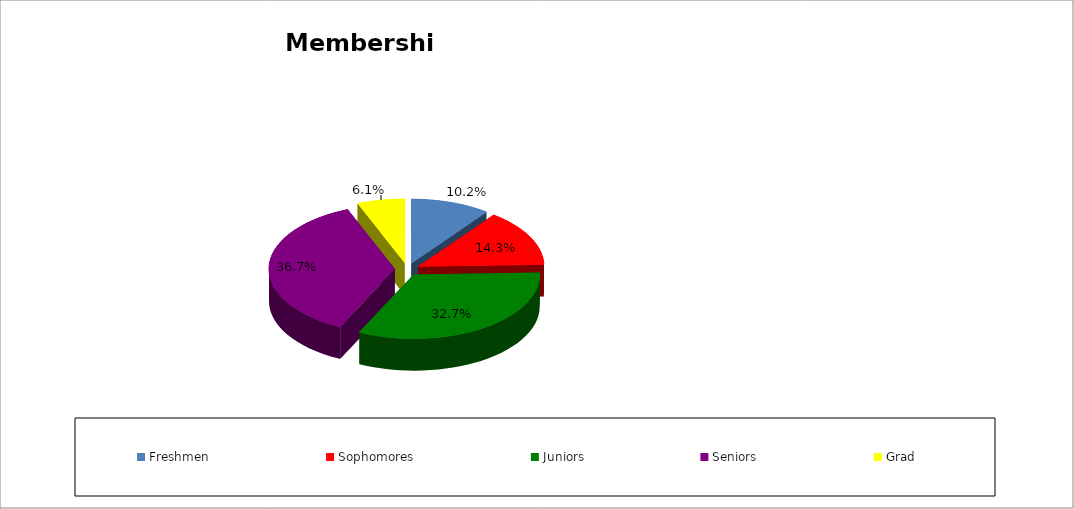
| Category | Series 0 |
|---|---|
| Freshmen | 5 |
| Sophomores | 7 |
| Juniors | 16 |
| Seniors | 18 |
| Grad | 3 |